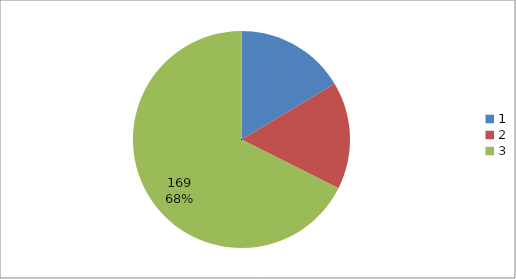
| Category | Series 0 |
|---|---|
| 0 | 41 |
| 1 | 40 |
| 2 | 169 |